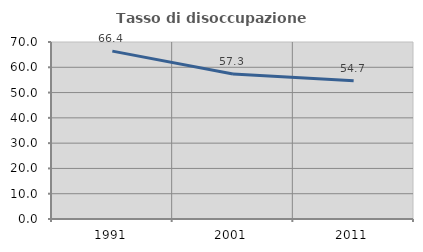
| Category | Tasso di disoccupazione giovanile  |
|---|---|
| 1991.0 | 66.398 |
| 2001.0 | 57.329 |
| 2011.0 | 54.651 |